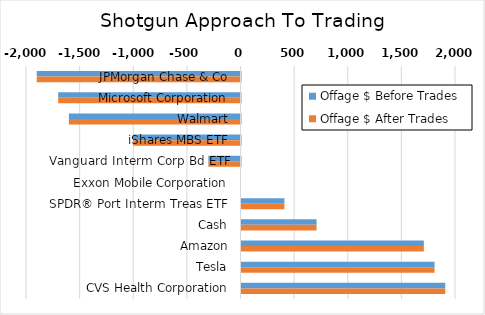
| Category | Offage $ Before Trades | Offage $ After Trades |
|---|---|---|
| JPMorgan Chase & Co | -1900 | -1900 |
| Microsoft Corporation | -1700 | -1700 |
| Walmart | -1600 | -1600 |
| iShares MBS ETF | -1000 | -1000 |
| Vanguard Interm Corp Bd ETF | -300 | -300 |
| Exxon Mobile Corporation | 0 | 0 |
| SPDR® Port Interm Treas ETF | 400 | 400 |
| Cash | 700 | 700 |
| Amazon | 1700 | 1700 |
| Tesla | 1800 | 1800 |
| CVS Health Corporation | 1900 | 1900 |